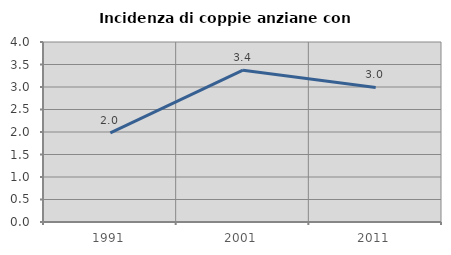
| Category | Incidenza di coppie anziane con figli |
|---|---|
| 1991.0 | 1.979 |
| 2001.0 | 3.373 |
| 2011.0 | 2.991 |